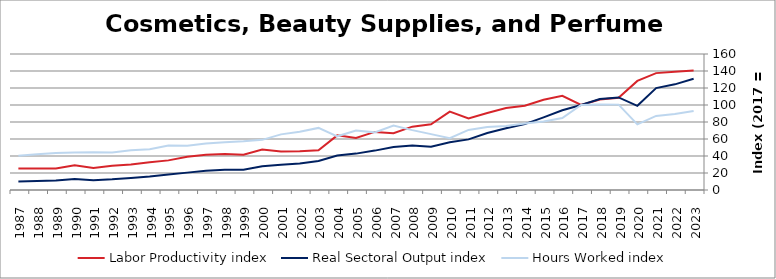
| Category | Labor Productivity index | Real Sectoral Output index | Hours Worked index |
|---|---|---|---|
| 2023.0 | 140.65 | 130.873 | 93.049 |
| 2022.0 | 139.052 | 124.295 | 89.388 |
| 2021.0 | 137.512 | 119.904 | 87.196 |
| 2020.0 | 128.323 | 99.03 | 77.173 |
| 2019.0 | 108.454 | 108.936 | 100.445 |
| 2018.0 | 106.384 | 107.12 | 100.691 |
| 2017.0 | 100 | 100 | 100 |
| 2016.0 | 110.72 | 93.844 | 84.757 |
| 2015.0 | 106.238 | 85.507 | 80.486 |
| 2014.0 | 99.044 | 77.505 | 78.253 |
| 2013.0 | 96.501 | 72.544 | 75.174 |
| 2012.0 | 90.543 | 67.027 | 74.028 |
| 2011.0 | 84.293 | 59.542 | 70.638 |
| 2010.0 | 92.14 | 56.073 | 60.856 |
| 2009.0 | 77.281 | 50.801 | 65.735 |
| 2008.0 | 74.505 | 52.463 | 70.415 |
| 2007.0 | 66.785 | 50.598 | 75.763 |
| 2006.0 | 68.347 | 46.34 | 67.801 |
| 2005.0 | 61.151 | 42.806 | 70.001 |
| 2004.0 | 64.256 | 40.573 | 63.143 |
| 2003.0 | 46.786 | 34.182 | 73.06 |
| 2002.0 | 45.6 | 31.285 | 68.607 |
| 2001.0 | 45.331 | 29.674 | 65.461 |
| 2000.0 | 47.519 | 28.03 | 58.986 |
| 1999.0 | 41.569 | 23.809 | 57.277 |
| 1998.0 | 42.44 | 23.799 | 56.076 |
| 1997.0 | 41.386 | 22.587 | 54.577 |
| 1996.0 | 39.196 | 20.444 | 52.158 |
| 1995.0 | 34.852 | 18.25 | 52.366 |
| 1994.0 | 32.768 | 15.744 | 48.046 |
| 1993.0 | 30.069 | 14.047 | 46.715 |
| 1992.0 | 28.417 | 12.546 | 44.148 |
| 1991.0 | 25.977 | 11.542 | 44.434 |
| 1990.0 | 29.175 | 12.847 | 44.035 |
| 1989.0 | 25.324 | 11.047 | 43.622 |
| 1988.0 | 25.377 | 10.65 | 41.966 |
| 1987.0 | 25.218 | 10.136 | 40.192 |